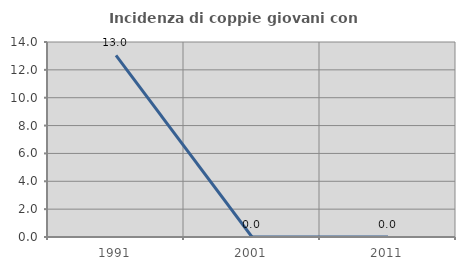
| Category | Incidenza di coppie giovani con figli |
|---|---|
| 1991.0 | 13.043 |
| 2001.0 | 0 |
| 2011.0 | 0 |